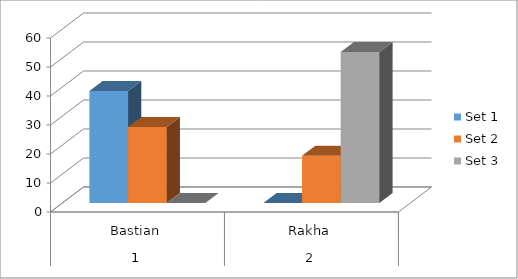
| Category | Set 1 | Set 2 | Set 3 |
|---|---|---|---|
| 0 | 38.6 | 26.2 | 0 |
| 1 | 0 | 16.3 | 52.1 |